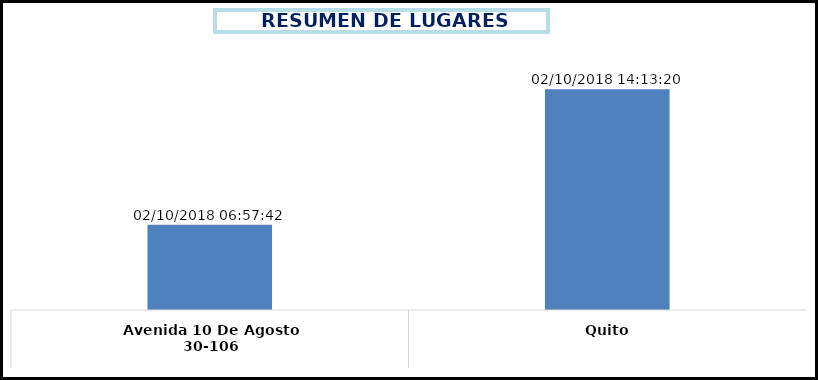
| Category | Total |
|---|---|
| 0 | 02/10/2018 |
| 1 | 02/10/2018 |